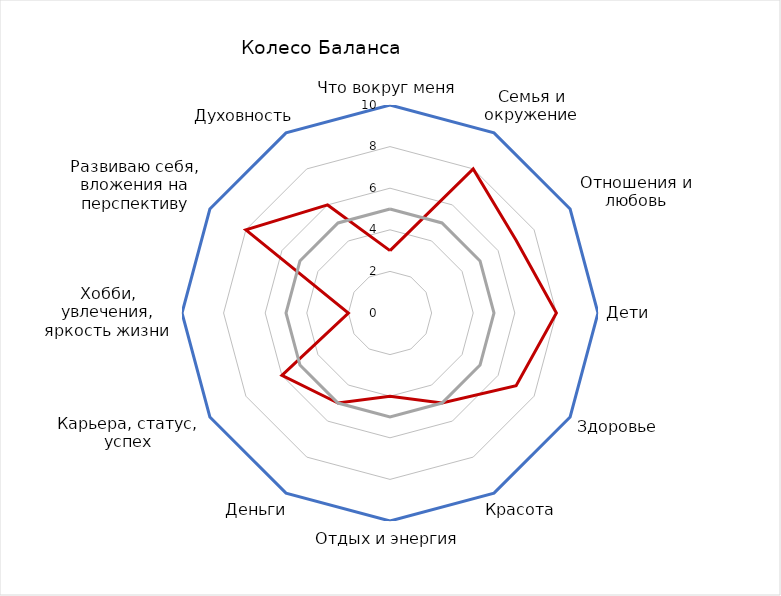
| Category | Series 0 | Series 1 | Series 2 |
|---|---|---|---|
| Что вокруг меня | 3 | 10 | 5 |
| Семья и окружение | 8 | 10 | 5 |
| Отношения и любовь | 7 | 10 | 5 |
| Дети | 8 | 10 | 5 |
| Здоровье | 7 | 10 | 5 |
| Красота | 5 | 10 | 5 |
| Отдых и энергия | 4 | 10 | 5 |
| Деньги | 5 | 10 | 5 |
| Карьера, статус, успех | 6 | 10 | 5 |
| Хобби, увлечения, яркость жизни | 2 | 10 | 5 |
| Развиваю себя, вложения на перспективу | 8 | 10 | 5 |
| Духовность | 6 | 10 | 5 |